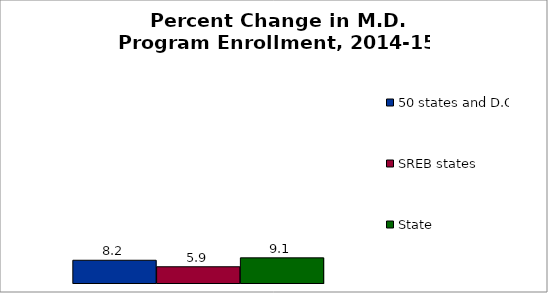
| Category | 50 states and D.C. | SREB states | State |
|---|---|---|---|
| 0 | 8.23 | 5.879 | 9.101 |